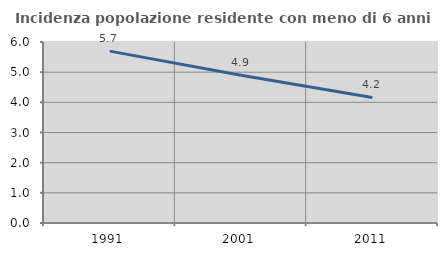
| Category | Incidenza popolazione residente con meno di 6 anni |
|---|---|
| 1991.0 | 5.697 |
| 2001.0 | 4.901 |
| 2011.0 | 4.16 |